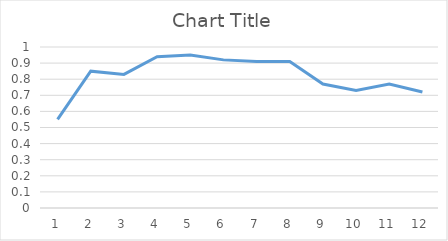
| Category | Series 0 |
|---|---|
| 0 | 0.55 |
| 1 | 0.85 |
| 2 | 0.83 |
| 3 | 0.94 |
| 4 | 0.95 |
| 5 | 0.92 |
| 6 | 0.91 |
| 7 | 0.91 |
| 8 | 0.77 |
| 9 | 0.73 |
| 10 | 0.77 |
| 11 | 0.72 |